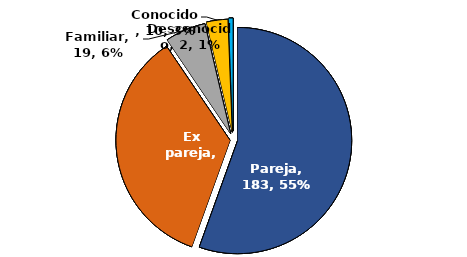
| Category | Series 0 |
|---|---|
| Pareja | 183 |
| Ex pareja | 116 |
| Familiar | 19 |
| Conocido | 10 |
| Desconocido | 2 |